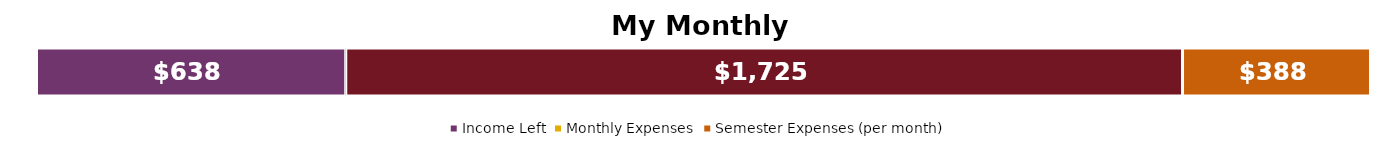
| Category | Income Left | Monthly Expenses | Semester Expenses (per month) |
|---|---|---|---|
| 0 | 637.5 | 1725 | 387.5 |